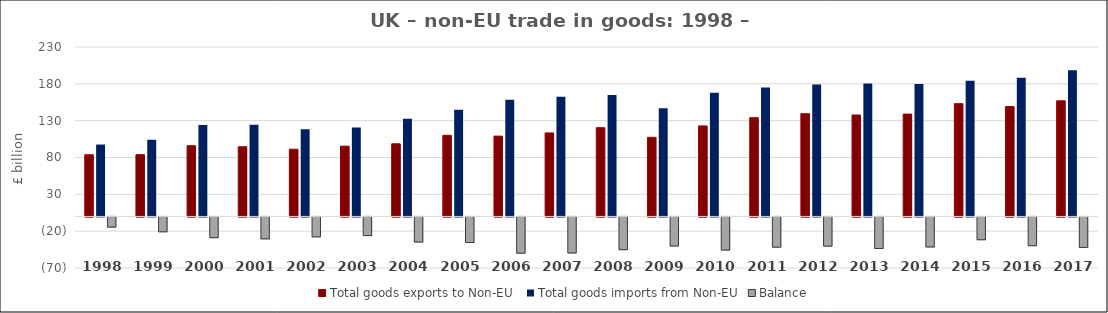
| Category | Total goods exports to Non-EU  | Total goods imports from Non-EU | Balance |
|---|---|---|---|
| 1998 | 83.763 | 97.607 | -13.844 |
| 1999 | 83.887 | 104.077 | -20.19 |
| 2000 | 95.997 | 124.145 | -28.148 |
| 2001 | 94.608 | 124.353 | -29.744 |
| 2002 | 91.267 | 118.335 | -27.068 |
| 2003 | 95.385 | 120.745 | -25.36 |
| 2004 | 98.62 | 132.703 | -34.083 |
| 2005 | 110.105 | 144.818 | -34.713 |
| 2006 | 109.036 | 158.246 | -49.21 |
| 2007 | 113.399 | 162.335 | -48.936 |
| 2008 | 120.455 | 164.923 | -44.468 |
| 2009 | 107.392 | 146.854 | -39.462 |
| 2010 | 122.898 | 167.855 | -44.957 |
| 2011 | 134.083 | 175.119 | -41.036 |
| 2012 | 139.494 | 179.192 | -39.698 |
| 2013 | 137.735 | 180.581 | -42.846 |
| 2014 | 138.883 | 179.665 | -40.782 |
| 2015 | 153.088 | 184.04 | -30.952 |
| 2016 | 149.206 | 188.257 | -39.051 |
| 2017 | 156.925 | 198.324 | -41.399 |